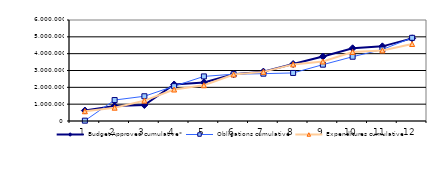
| Category | Budget Approved cumulative* | Obligations cumulative | Expenditures cumulative |
|---|---|---|---|
| 0 | 621513.14 | 19935.614 | 579569.059 |
| 1 | 894948.337 | 1245108.614 | 790694.859 |
| 2 | 951421.42 | 1470070.522 | 1208639.859 |
| 3 | 2168363.097 | 2069658.84 | 1870218.859 |
| 4 | 2286006.24 | 2649687.911 | 2122543.859 |
| 5 | 2777337.81 | 2781587.651 | 2765047.859 |
| 6 | 2933320.809 | 2812179.311 | 2917854.859 |
| 7 | 3384750.885 | 2855050.291 | 3363349.859 |
| 8 | 3828142.161 | 3346557.69 | 3533185.859 |
| 9 | 4318455.494 | 3818511.69 | 4103192.859 |
| 10 | 4433829.385 | 4248501.536 | 4192692.859 |
| 11 | 4909342.161 | 4941563.536 | 4573329.859 |